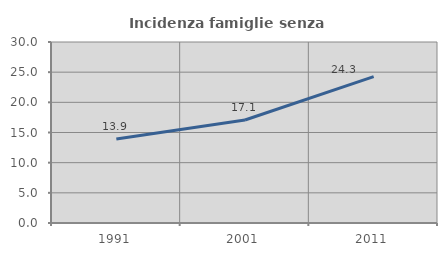
| Category | Incidenza famiglie senza nuclei |
|---|---|
| 1991.0 | 13.914 |
| 2001.0 | 17.068 |
| 2011.0 | 24.254 |